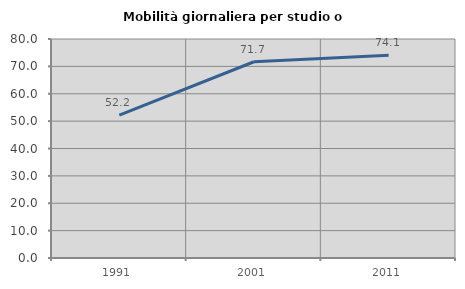
| Category | Mobilità giornaliera per studio o lavoro |
|---|---|
| 1991.0 | 52.229 |
| 2001.0 | 71.684 |
| 2011.0 | 74.092 |